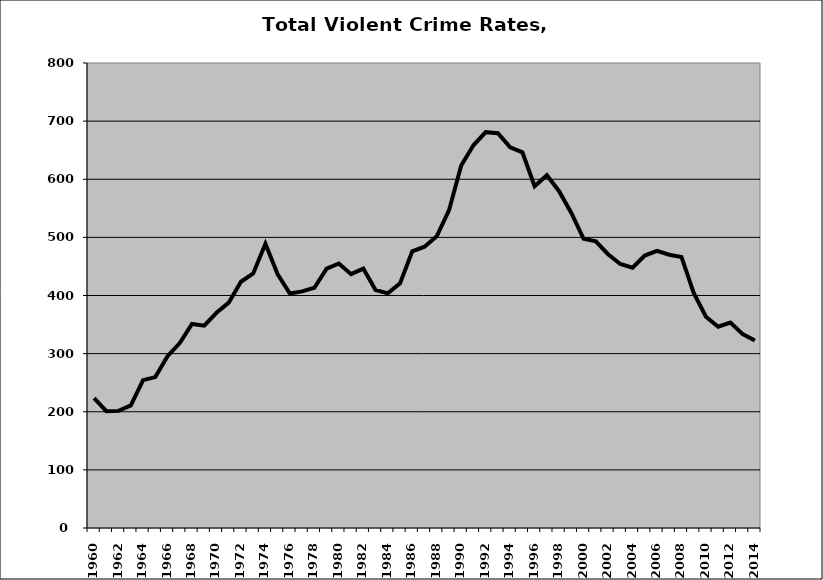
| Category | VCR |
|---|---|
| 1960.0 | 223.478 |
| 1961.0 | 201.019 |
| 1962.0 | 201.501 |
| 1963.0 | 210.882 |
| 1964.0 | 254.431 |
| 1965.0 | 259.565 |
| 1966.0 | 295.5 |
| 1967.0 | 318.055 |
| 1968.0 | 351.022 |
| 1969.0 | 348.069 |
| 1970.0 | 370.204 |
| 1971.0 | 387.719 |
| 1972.0 | 423.61 |
| 1973.0 | 437.815 |
| 1974.0 | 488.905 |
| 1975.0 | 436.452 |
| 1976.0 | 403.383 |
| 1977.0 | 407.095 |
| 1978.0 | 413.376 |
| 1979.0 | 446.111 |
| 1980.0 | 455.006 |
| 1981.0 | 436.666 |
| 1982.0 | 446.337 |
| 1983.0 | 409.586 |
| 1984.0 | 403.65 |
| 1985.0 | 420.895 |
| 1986.0 | 475.881 |
| 1987.0 | 484.001 |
| 1988.0 | 501.885 |
| 1989.0 | 546.37 |
| 1990.0 | 623.537 |
| 1991.0 | 658.379 |
| 1992.0 | 680.988 |
| 1993.0 | 679.309 |
| 1994.0 | 654.993 |
| 1995.0 | 646.393 |
| 1996.0 | 588.12 |
| 1997.0 | 607.017 |
| 1998.0 | 579.42 |
| 1999.0 | 542.088 |
| 2000.0 | 497.57 |
| 2001.0 | 493.108 |
| 2002.0 | 470.971 |
| 2003.0 | 454.128 |
| 2004.0 | 447.797 |
| 2005.0 | 468.725 |
| 2006.0 | 476.836 |
| 2007.0 | 470.112 |
| 2008.0 | 466.307 |
| 2009.0 | 404.503 |
| 2010.0 | 363.411 |
| 2011.0 | 346.292 |
| 2012.0 | 353.536 |
| 2013.0 | 333.57 |
| 2014.0 | 322.678 |